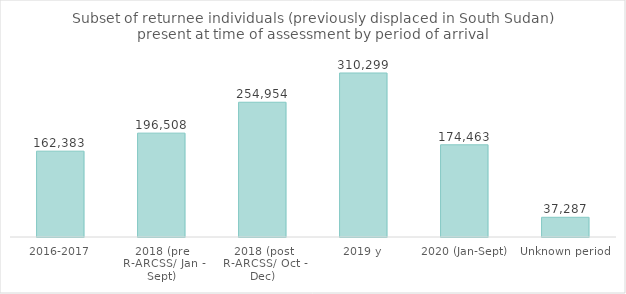
| Category | Total |
|---|---|
| 2016-2017 | 162383 |
| 2018 (pre R-ARCSS/ Jan - Sept) | 196508 |
| 2018 (post R-ARCSS/ Oct - Dec) | 254954 |
| 2019 y | 310299 |
| 2020 (Jan-Sept) | 174463 |
| Unknown period | 37287 |